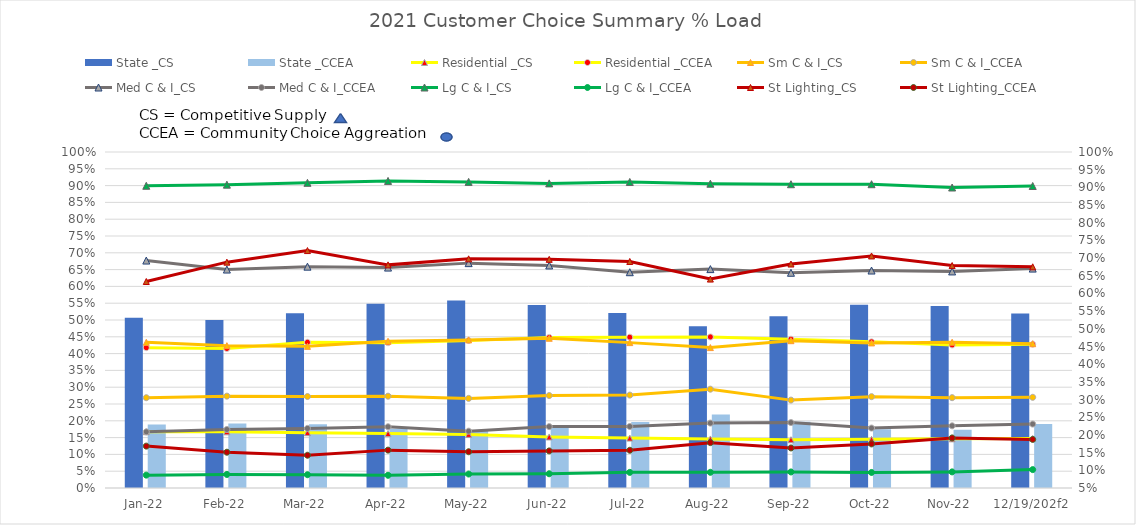
| Category | State _CS | State _CCEA |
|---|---|---|
| 44197.0 | 0.531 | 0.23 |
| 44228.0 | 0.525 | 0.232 |
| 44256.0 | 0.544 | 0.23 |
| 44287.0 | 0.571 | 0.217 |
| 44317.0 | 0.58 | 0.214 |
| 44348.0 | 0.567 | 0.225 |
| 44378.0 | 0.545 | 0.237 |
| 44409.0 | 0.508 | 0.258 |
| 44440.0 | 0.536 | 0.238 |
| 44470.0 | 0.568 | 0.216 |
| 44501.0 | 0.565 | 0.215 |
| 44531.0 | 0.544 | 0.231 |